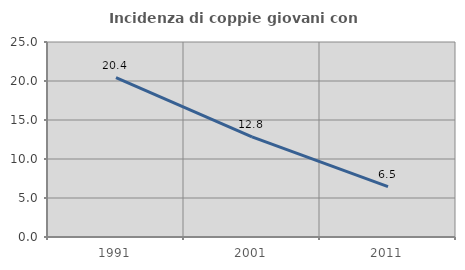
| Category | Incidenza di coppie giovani con figli |
|---|---|
| 1991.0 | 20.437 |
| 2001.0 | 12.847 |
| 2011.0 | 6.458 |